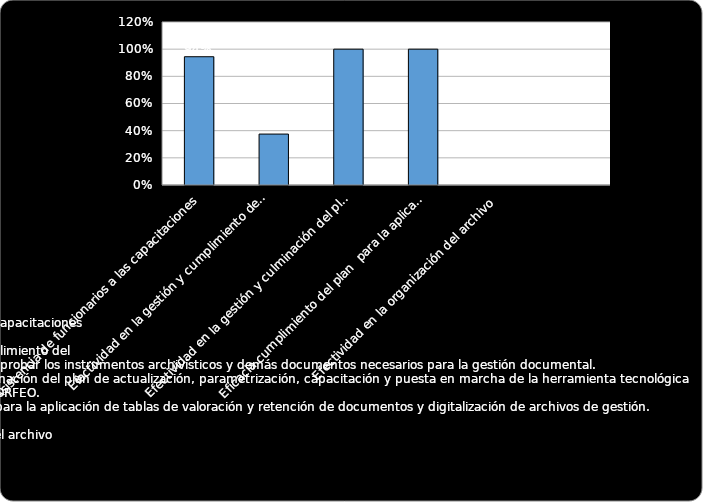
| Category | % Cumplimiento  |
|---|---|
| Asistencia de funcionarios a las capacitaciones | 0.944 |
| Efectividad en la gestión y cumplimiento del
plan para elaborar, actualizar y aprobar los instrumentos archivísticos y demás documentos necesarios para la gestión documental. | 0.375 |
| Efectividad en la gestión y culminación del plan de actualización, parametrización, capacitación y puesta en marcha de la herramienta tecnológica integral de gestión documental ORFEO. | 1 |
| Eficacia cumplimiento del plan  para la aplicación de tablas de valoración y retención de documentos y digitalización de archivos de gestión. | 1 |
| Efectividad en la organización del archivo | 0 |